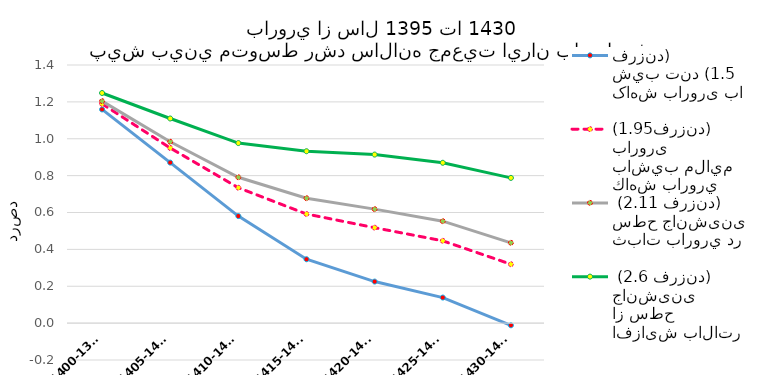
| Category | کاهش باروری با شيب تند (1.5 فرزند) | كاهش باروري باشيب ملايم باروری (1.95فرزند) | ثبات باروري در سطح جانشینی
 (2.11 فرزند) | افزایش بالاتر از سطح جانشینی
 (2.6 فرزند) |
|---|---|---|---|---|
| 1400-1395 | 1.159 | 1.189 | 1.204 | 1.248 |
| 1405-1400 | 0.871 | 0.95 | 0.984 | 1.11 |
| 1410-1405 | 0.581 | 0.734 | 0.791 | 0.977 |
| 1415-1410 | 0.347 | 0.592 | 0.678 | 0.932 |
| 1420-1415 | 0.225 | 0.518 | 0.618 | 0.914 |
| 1425-1420 | 0.139 | 0.446 | 0.553 | 0.87 |
| 1430-1425 | -0.012 | 0.319 | 0.436 | 0.788 |